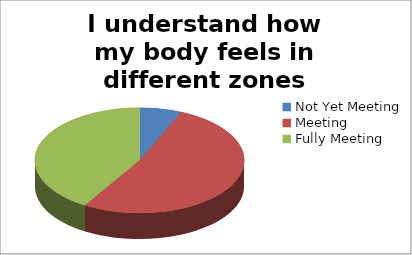
| Category | I understand how my body feels in different zones |
|---|---|
| Not Yet Meeting | 3 |
| Meeting | 24 |
| Fully Meeting | 19 |